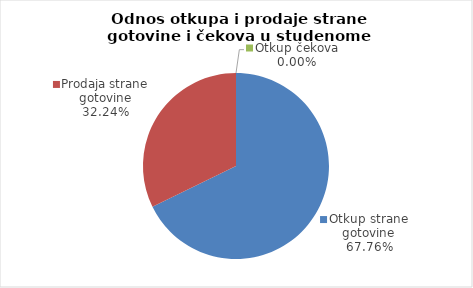
| Category | Series 0 |
|---|---|
| Otkup strane gotovine | 67.762 |
| Prodaja strane gotovine | 32.238 |
| Otkup čekova | 0 |